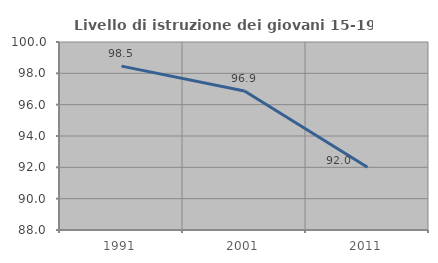
| Category | Livello di istruzione dei giovani 15-19 anni |
|---|---|
| 1991.0 | 98.462 |
| 2001.0 | 96.875 |
| 2011.0 | 92 |